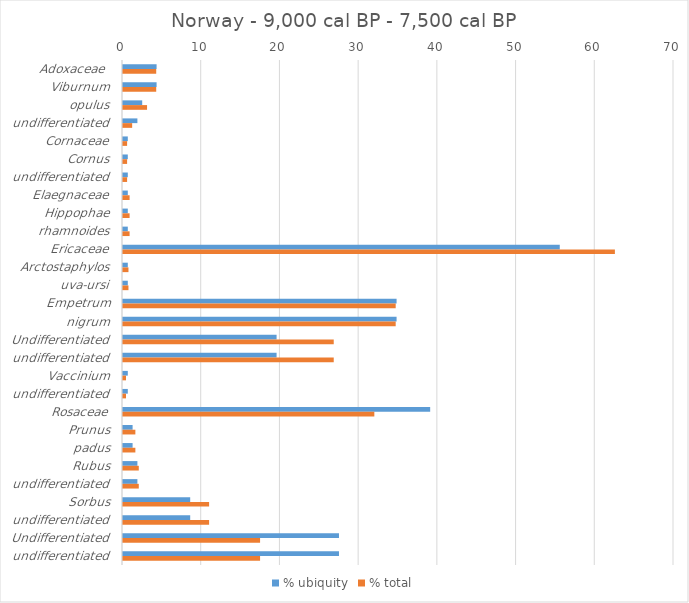
| Category | % ubiquity | % total |
|---|---|---|
| Adoxaceae  | 4.268 | 4.219 |
| Viburnum | 4.268 | 4.219 |
| opulus | 2.439 | 3.055 |
| undifferentiated | 1.829 | 1.164 |
| Cornaceae | 0.61 | 0.521 |
| Cornus | 0.61 | 0.521 |
| undifferentiated | 0.61 | 0.521 |
| Elaegnaceae | 0.61 | 0.839 |
| Hippophae | 0.61 | 0.839 |
| rhamnoides | 0.61 | 0.839 |
| Ericaceae | 55.488 | 62.492 |
| Arctostaphylos | 0.61 | 0.694 |
| uva-ursi | 0.61 | 0.694 |
| Empetrum | 34.756 | 34.642 |
| nigrum | 34.756 | 34.642 |
| Undifferentiated | 19.512 | 26.772 |
| undifferentiated | 19.512 | 26.772 |
| Vaccinium | 0.61 | 0.383 |
| undifferentiated | 0.61 | 0.383 |
| Rosaceae | 39.024 | 31.93 |
| Prunus | 1.22 | 1.571 |
| padus | 1.22 | 1.571 |
| Rubus | 1.829 | 2.005 |
| undifferentiated | 1.829 | 2.005 |
| Sorbus | 8.537 | 10.939 |
| undifferentiated | 8.537 | 10.939 |
| Undifferentiated | 27.439 | 17.414 |
| undifferentiated | 27.439 | 17.414 |